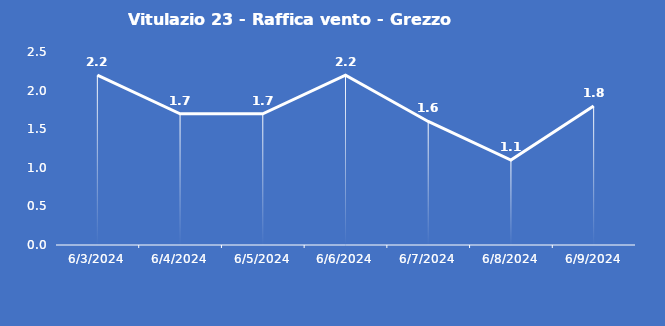
| Category | Vitulazio 23 - Raffica vento - Grezzo (m/s) |
|---|---|
| 6/3/24 | 2.2 |
| 6/4/24 | 1.7 |
| 6/5/24 | 1.7 |
| 6/6/24 | 2.2 |
| 6/7/24 | 1.6 |
| 6/8/24 | 1.1 |
| 6/9/24 | 1.8 |